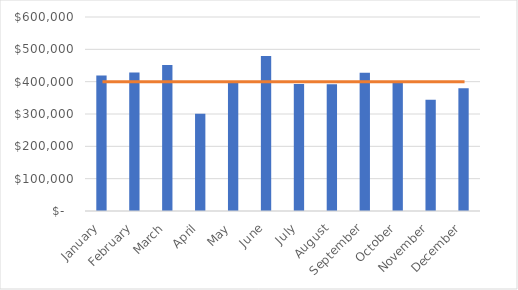
| Category | Sales results |
|---|---|
| January | 419175 |
| February | 428723 |
| March | 451306 |
| April | 300520 |
| May | 397390 |
| June | 479522 |
| July | 392501 |
| August | 392341 |
| September | 427901 |
| October | 402350 |
| November | 344284 |
| December | 379284 |